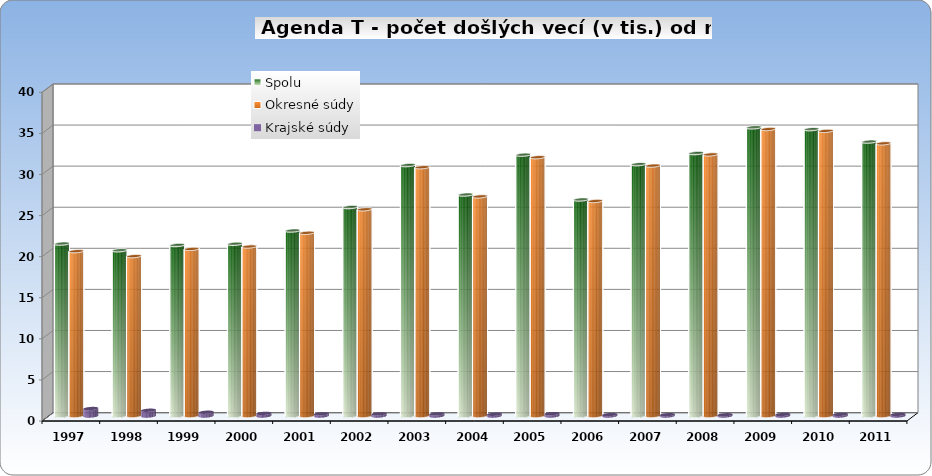
| Category | Spolu | Okresné súdy | Krajské súdy |
|---|---|---|---|
| 1997.0 | 20.97 | 20.06 | 0.91 |
| 1998.0 | 20.16 | 19.46 | 0.7 |
| 1999.0 | 20.8 | 20.34 | 0.46 |
| 2000.0 | 20.95 | 20.63 | 0.32 |
| 2001.0 | 22.56 | 22.3 | 0.26 |
| 2002.0 | 25.42 | 25.16 | 0.26 |
| 2003.0 | 30.53 | 30.28 | 0.25 |
| 2004.0 | 26.94 | 26.73 | 0.21 |
| 2005.0 | 31.79 | 31.5 | 0.29 |
| 2006.0 | 26.34 | 26.17 | 0.17 |
| 2007.0 | 30.64 | 30.48 | 0.16 |
| 2008.0 | 31.99 | 31.84 | 0.15 |
| 2009.0 | 35.12 | 34.929 | 0.19 |
| 2010.0 | 34.9 | 34.703 | 0.2 |
| 2011.0 | 33.382 | 33.188 | 0.194 |